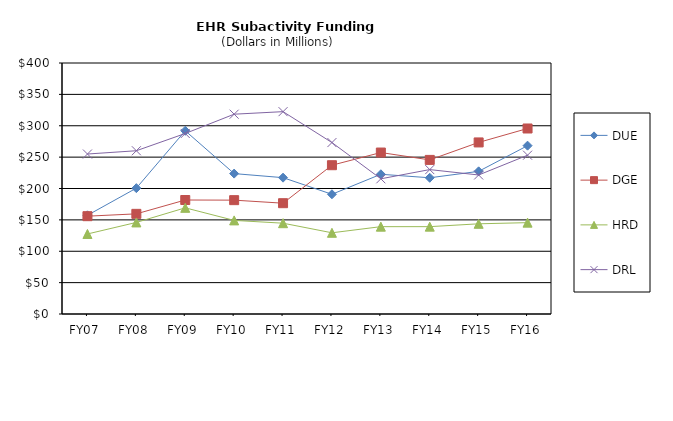
| Category | DUE | DGE | HRD | DRL |
|---|---|---|---|---|
| FY07 | 157.28 | 155.9 | 127.53 | 254.94 |
| FY08 | 200.56 | 159.59 | 145.94 | 260.17 |
| FY09 | 291.99 | 181.67 | 169.18 | 287.67 |
| FY10 | 223.75 | 181.43 | 149.16 | 318.42 |
| FY11 | 217.28 | 176.58 | 144.71 | 322.47 |
| FY12 | 190.79 | 237.11 | 129.41 | 273.23 |
| FY13 | 222.68 | 257.31 | 139.18 | 215.45 |
| FY14 | 217.1 | 245.58 | 139.21 | 230.13 |
| FY15 | 227.34 | 273.41 | 143.73 | 221.52 |
| FY16 | 268.26 | 295.64 | 145.59 | 253.08 |